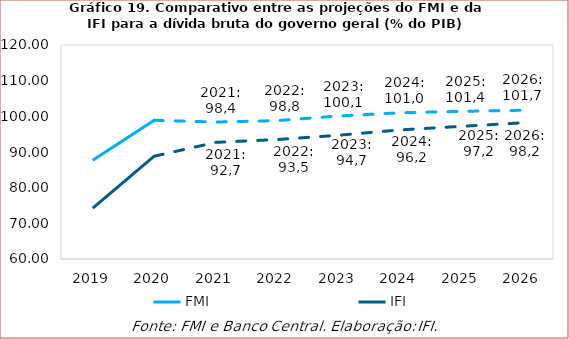
| Category | FMI | IFI |
|---|---|---|
| 2019.0 | 87.7 | 74.25 |
| 2020.0 | 98.9 | 88.82 |
| 2021.0 | 98.4 | 92.7 |
| 2022.0 | 98.8 | 93.5 |
| 2023.0 | 100.1 | 94.7 |
| 2024.0 | 101 | 96.2 |
| 2025.0 | 101.4 | 97.2 |
| 2026.0 | 101.7 | 98.2 |